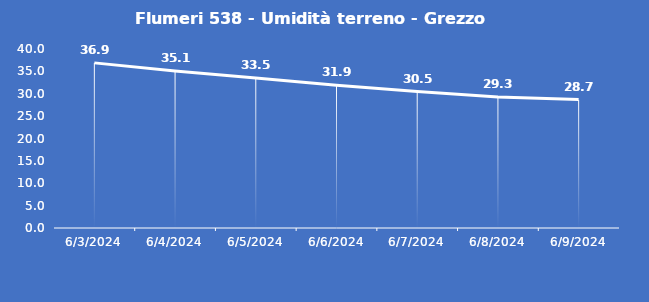
| Category | Flumeri 538 - Umidità terreno - Grezzo (%VWC) |
|---|---|
| 6/3/24 | 36.9 |
| 6/4/24 | 35.1 |
| 6/5/24 | 33.5 |
| 6/6/24 | 31.9 |
| 6/7/24 | 30.5 |
| 6/8/24 | 29.3 |
| 6/9/24 | 28.7 |